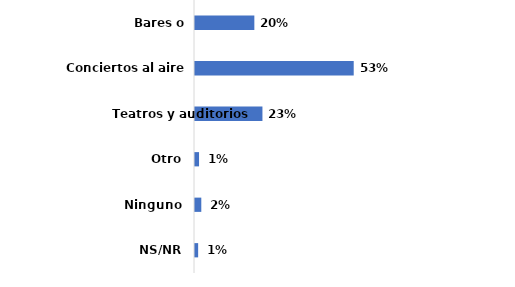
| Category | Series 0 |
|---|---|
| Bares o restaurantes | 0.198 |
| Conciertos al aire libre | 0.531 |
| Teatros y auditorios | 0.226 |
| Otro | 0.014 |
| Ninguno | 0.021 |
| NS/NR | 0.011 |